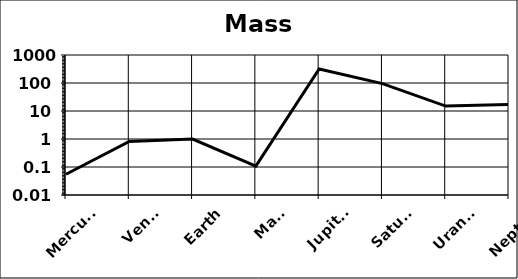
| Category | Mass (Earth=1) |
|---|---|
| Mercury | 0.055 |
| Venus | 0.815 |
| Earth | 1 |
| Mars | 0.107 |
| Jupiter | 318 |
| Saturn | 95 |
| Uranus | 15 |
| Neptune | 17 |